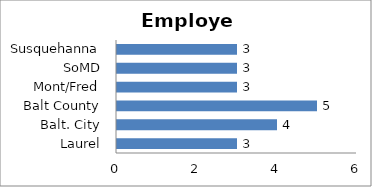
| Category | Employed |
|---|---|
| Laurel | 3 |
| Balt. City | 4 |
| Balt County | 5 |
| Mont/Fred | 3 |
| SoMD | 3 |
| Susquehanna | 3 |